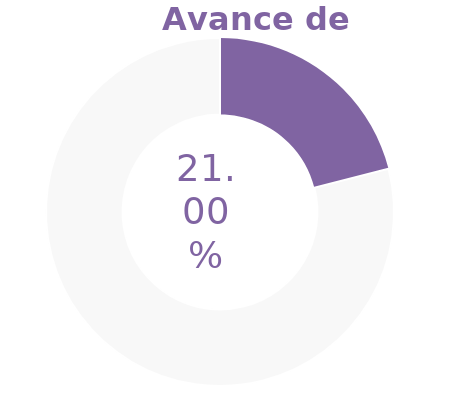
| Category | Series 0 |
|---|---|
| Acumulado 1 Trimestre | 0.21 |
| Año | -0.79 |